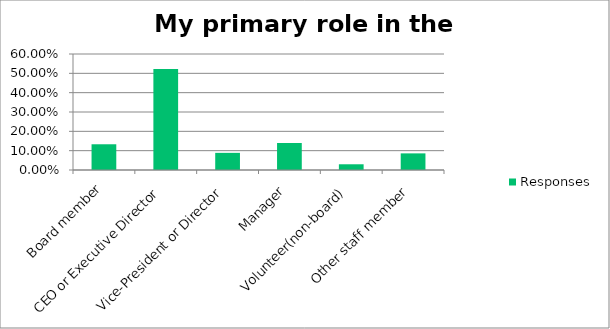
| Category | Responses |
|---|---|
| Board member | 0.133 |
| CEO or Executive Director | 0.523 |
| Vice-President or Director | 0.089 |
| Manager | 0.14 |
| Volunteer(non-board) | 0.03 |
| Other staff member | 0.086 |